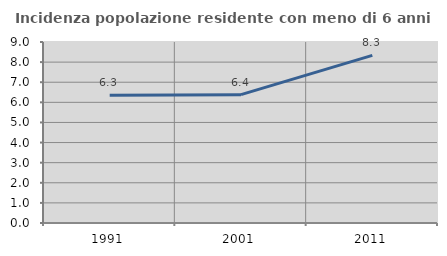
| Category | Incidenza popolazione residente con meno di 6 anni |
|---|---|
| 1991.0 | 6.35 |
| 2001.0 | 6.382 |
| 2011.0 | 8.335 |